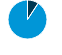
| Category | Series 0 |
|---|---|
| Electricity | 0.093 |
| Natural Gas | 0.907 |
| Distillate Fuel Oil | 0 |